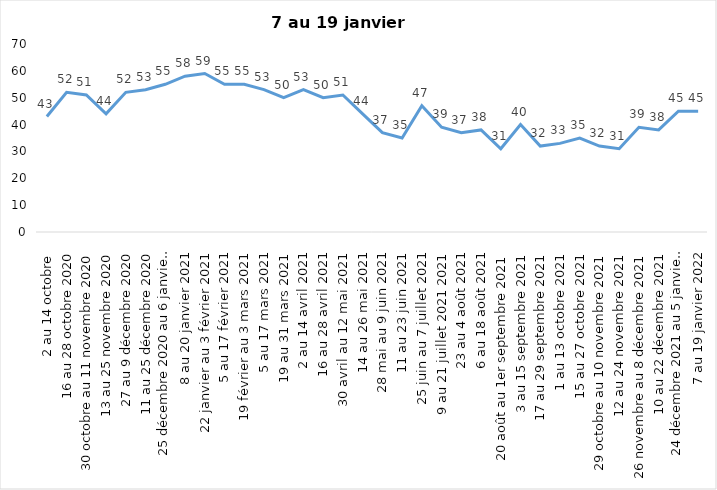
| Category | Toujours aux trois mesures |
|---|---|
| 2 au 14 octobre  | 43 |
| 16 au 28 octobre 2020 | 52 |
| 30 octobre au 11 novembre 2020 | 51 |
| 13 au 25 novembre 2020 | 44 |
| 27 au 9 décembre 2020 | 52 |
| 11 au 25 décembre 2020 | 53 |
| 25 décembre 2020 au 6 janvier 2021 | 55 |
| 8 au 20 janvier 2021 | 58 |
| 22 janvier au 3 février 2021 | 59 |
| 5 au 17 février 2021 | 55 |
| 19 février au 3 mars 2021 | 55 |
| 5 au 17 mars 2021 | 53 |
| 19 au 31 mars 2021 | 50 |
| 2 au 14 avril 2021 | 53 |
| 16 au 28 avril 2021 | 50 |
| 30 avril au 12 mai 2021 | 51 |
| 14 au 26 mai 2021 | 44 |
| 28 mai au 9 juin 2021 | 37 |
| 11 au 23 juin 2021 | 35 |
| 25 juin au 7 juillet 2021 | 47 |
| 9 au 21 juillet 2021 2021 | 39 |
| 23 au 4 août 2021 | 37 |
| 6 au 18 août 2021 | 38 |
| 20 août au 1er septembre 2021 | 31 |
| 3 au 15 septembre 2021 | 40 |
| 17 au 29 septembre 2021 | 32 |
| 1 au 13 octobre 2021 | 33 |
| 15 au 27 octobre 2021 | 35 |
| 29 octobre au 10 novembre 2021 | 32 |
| 12 au 24 novembre 2021 | 31 |
| 26 novembre au 8 décembre 2021 | 39 |
| 10 au 22 décembre 2021 | 38 |
| 24 décembre 2021 au 5 janvier 2022 2022 | 45 |
| 7 au 19 janvier 2022 | 45 |